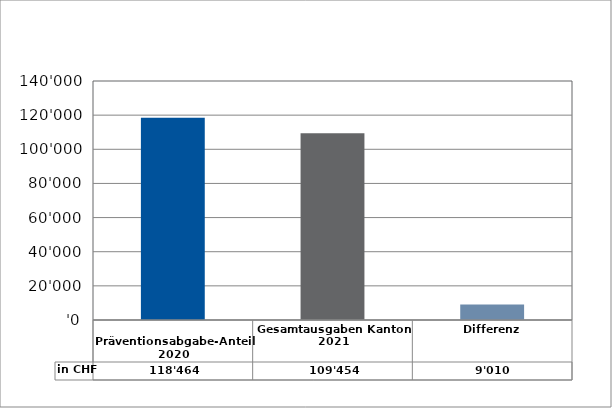
| Category | in CHF |
|---|---|
| 
Präventionsabgabe-Anteil 2020

 | 118464.4 |
| Gesamtausgaben Kanton 2021
 | 109454.4 |
| Differenz | 9010 |